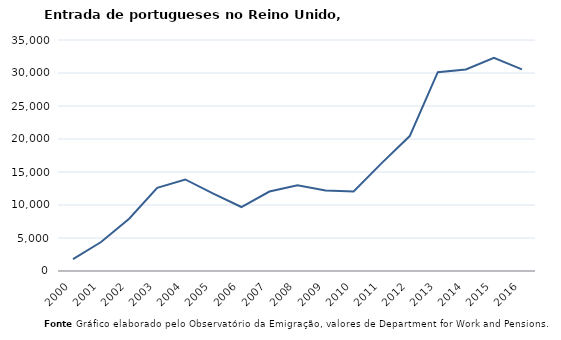
| Category | Entradas |
|---|---|
| 2000.0 | 1811 |
| 2001.0 | 4396 |
| 2002.0 | 7915 |
| 2003.0 | 12603 |
| 2004.0 | 13867 |
| 2005.0 | 11712 |
| 2006.0 | 9696 |
| 2007.0 | 12039 |
| 2008.0 | 12983 |
| 2009.0 | 12211 |
| 2010.0 | 12064 |
| 2011.0 | 16347 |
| 2012.0 | 20443 |
| 2013.0 | 30121 |
| 2014.0 | 30546 |
| 2015.0 | 32301 |
| 2016.0 | 30543 |